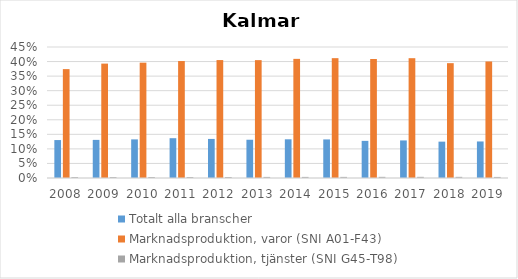
| Category | Totalt alla branscher | Marknadsproduktion, varor (SNI A01-F43) | Marknadsproduktion, tjänster (SNI G45-T98) |
|---|---|---|---|
| 2008.0 | 0.13 | 0.374 | 0.003 |
| 2009.0 | 0.131 | 0.393 | 0.003 |
| 2010.0 | 0.133 | 0.396 | 0.003 |
| 2011.0 | 0.137 | 0.402 | 0.003 |
| 2012.0 | 0.134 | 0.405 | 0.003 |
| 2013.0 | 0.131 | 0.405 | 0.004 |
| 2014.0 | 0.133 | 0.409 | 0.004 |
| 2015.0 | 0.133 | 0.412 | 0.004 |
| 2016.0 | 0.128 | 0.409 | 0.004 |
| 2017.0 | 0.129 | 0.412 | 0.004 |
| 2018.0 | 0.125 | 0.394 | 0.004 |
| 2019.0 | 0.126 | 0.4 | 0.004 |